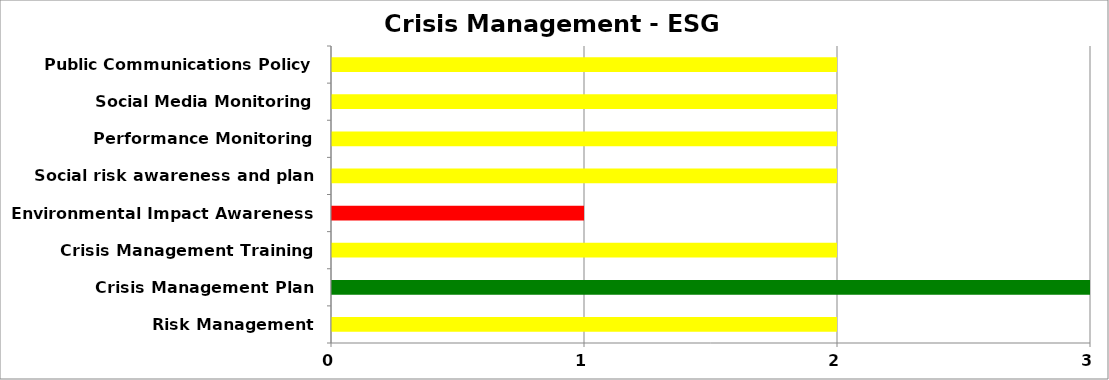
| Category | Series 0 | Series 1 | Series 2 |
|---|---|---|---|
| Risk Management | 0 | 2 | 0 |
| Crisis Management Plan | 3 | 0 | 0 |
| Crisis Management Training | 0 | 2 | 0 |
| Environmental Impact Awareness | 0 | 0 | 1 |
| Social risk awareness and plan | 0 | 2 | 0 |
| Performance Monitoring | 0 | 2 | 0 |
| Social Media Monitoring | 0 | 2 | 0 |
| Public Communications Policy | 0 | 2 | 0 |